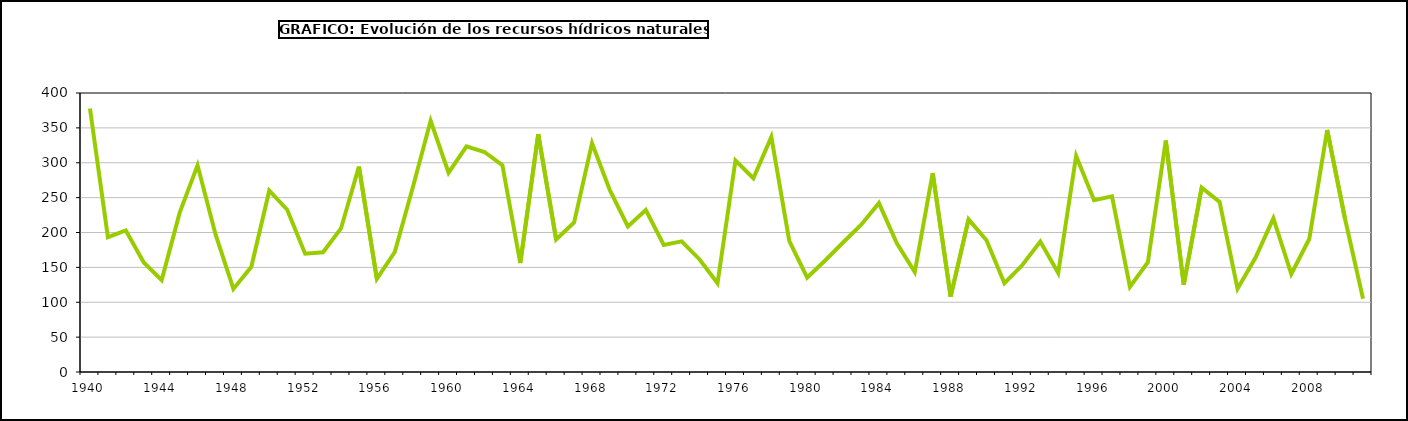
| Category | Recursos hídricos naturales (mm) |
|---|---|
| 1940.0 | 377.71 |
| 1941.0 | 193.31 |
| 1942.0 | 203.01 |
| 1943.0 | 157.13 |
| 1944.0 | 131.7 |
| 1945.0 | 228.1 |
| 1946.0 | 296.3 |
| 1947.0 | 197.52 |
| 1948.0 | 119.01 |
| 1949.0 | 150.82 |
| 1950.0 | 259.97 |
| 1951.0 | 232.61 |
| 1952.0 | 169.59 |
| 1953.0 | 171.62 |
| 1954.0 | 205.79 |
| 1955.0 | 294.44 |
| 1956.0 | 133.56 |
| 1957.0 | 172.05 |
| 1958.0 | 264.07 |
| 1959.0 | 360.25 |
| 1960.0 | 285.72 |
| 1961.0 | 323.56 |
| 1962.0 | 315.44 |
| 1963.0 | 296.5 |
| 1964.0 | 156.25 |
| 1965.0 | 341 |
| 1966.0 | 189.9 |
| 1967.0 | 214.24 |
| 1968.0 | 328.04 |
| 1969.0 | 260.27 |
| 1970.0 | 208.74 |
| 1971.0 | 232.18 |
| 1972.0 | 182.09 |
| 1973.0 | 187.37 |
| 1974.0 | 161.34 |
| 1975.0 | 127.43 |
| 1976.0 | 303.19 |
| 1977.0 | 277.86 |
| 1978.0 | 336.88 |
| 1979.0 | 187.88 |
| 1980.0 | 135.39 |
| 1981.0 | 159.84 |
| 1982.0 | 185.71 |
| 1983.0 | 210.84 |
| 1984.0 | 242.11 |
| 1985.0 | 184.35 |
| 1986.0 | 143.18 |
| 1987.0 | 285.11 |
| 1988.0 | 108.08 |
| 1989.0 | 218.84 |
| 1990.0 | 188.89 |
| 1991.0 | 127.35 |
| 1992.0 | 153.36 |
| 1993.0 | 187.04 |
| 1994.0 | 141.83 |
| 1995.0 | 309.78 |
| 1996.0 | 246.29 |
| 1997.0 | 251.82 |
| 1998.0 | 122.02 |
| 1999.0 | 157.36 |
| 2000.0 | 331.89 |
| 2001.0 | 125.15 |
| 2002.0 | 264.29 |
| 2003.0 | 243.93 |
| 2004.0 | 119.47 |
| 2005.0 | 163.67 |
| 2006.0 | 220.3 |
| 2007.0 | 140.5 |
| 2008.0 | 190.63 |
| 2009.0 | 346.99 |
| 2010.0 | 219 |
| 2011.0 | 104.95 |